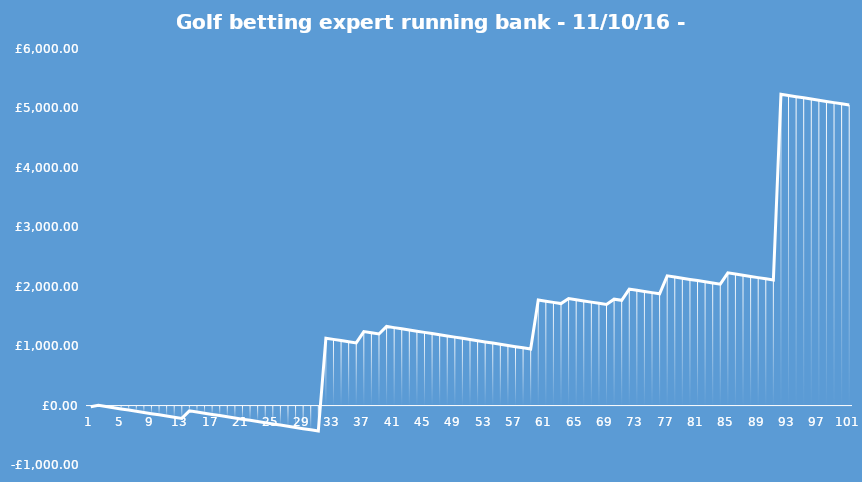
| Category | Running Bank |
|---|---|
| 0 | -20 |
| 1 | 4 |
| 2 | -16 |
| 3 | -36 |
| 4 | -56 |
| 5 | -76 |
| 6 | -96 |
| 7 | -116 |
| 8 | -136 |
| 9 | -156 |
| 10 | -176 |
| 11 | -196 |
| 12 | -216 |
| 13 | -88.5 |
| 14 | -108.5 |
| 15 | -128.5 |
| 16 | -148.5 |
| 17 | -168.5 |
| 18 | -188.5 |
| 19 | -208.5 |
| 20 | -228.5 |
| 21 | -248.5 |
| 22 | -268.5 |
| 23 | -288.5 |
| 24 | -308.5 |
| 25 | -328.5 |
| 26 | -348.5 |
| 27 | -368.5 |
| 28 | -388.5 |
| 29 | -408.5 |
| 30 | -428.5 |
| 31 | 1134 |
| 32 | 1114 |
| 33 | 1094 |
| 34 | 1074 |
| 35 | 1054 |
| 36 | 1244 |
| 37 | 1224 |
| 38 | 1204 |
| 39 | 1331.5 |
| 40 | 1311.5 |
| 41 | 1291.5 |
| 42 | 1271.5 |
| 43 | 1251.5 |
| 44 | 1231.5 |
| 45 | 1211.5 |
| 46 | 1191.5 |
| 47 | 1171.5 |
| 48 | 1151.5 |
| 49 | 1131.5 |
| 50 | 1111.5 |
| 51 | 1091.5 |
| 52 | 1071.5 |
| 53 | 1051.5 |
| 54 | 1031.5 |
| 55 | 1011.5 |
| 56 | 991.5 |
| 57 | 971.5 |
| 58 | 951.5 |
| 59 | 1776.5 |
| 60 | 1756.5 |
| 61 | 1736.5 |
| 62 | 1716.5 |
| 63 | 1800.5 |
| 64 | 1780.5 |
| 65 | 1760.5 |
| 66 | 1740.5 |
| 67 | 1720.5 |
| 68 | 1700.5 |
| 69 | 1790.5 |
| 70 | 1770.5 |
| 71 | 1960.5 |
| 72 | 1940.5 |
| 73 | 1920.5 |
| 74 | 1900.5 |
| 75 | 1880.5 |
| 76 | 2182.9 |
| 77 | 2162.9 |
| 78 | 2142.9 |
| 79 | 2122.9 |
| 80 | 2102.9 |
| 81 | 2082.9 |
| 82 | 2062.9 |
| 83 | 2042.9 |
| 84 | 2232.9 |
| 85 | 2212.9 |
| 86 | 2192.9 |
| 87 | 2172.9 |
| 88 | 2152.9 |
| 89 | 2132.9 |
| 90 | 2112.9 |
| 91 | 5237.9 |
| 92 | 5217.9 |
| 93 | 5197.9 |
| 94 | 5177.9 |
| 95 | 5157.9 |
| 96 | 5137.9 |
| 97 | 5117.9 |
| 98 | 5097.9 |
| 99 | 5077.9 |
| 100 | 5057.9 |